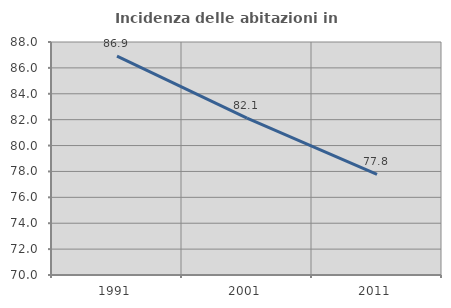
| Category | Incidenza delle abitazioni in proprietà  |
|---|---|
| 1991.0 | 86.912 |
| 2001.0 | 82.118 |
| 2011.0 | 77.778 |